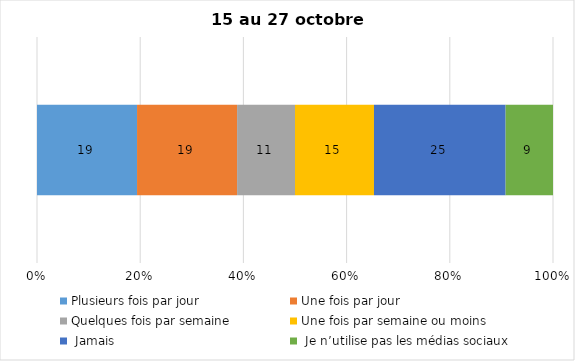
| Category | Plusieurs fois par jour | Une fois par jour | Quelques fois par semaine   | Une fois par semaine ou moins   |  Jamais   |  Je n’utilise pas les médias sociaux |
|---|---|---|---|---|---|---|
| 0 | 19 | 19 | 11 | 15 | 25 | 9 |